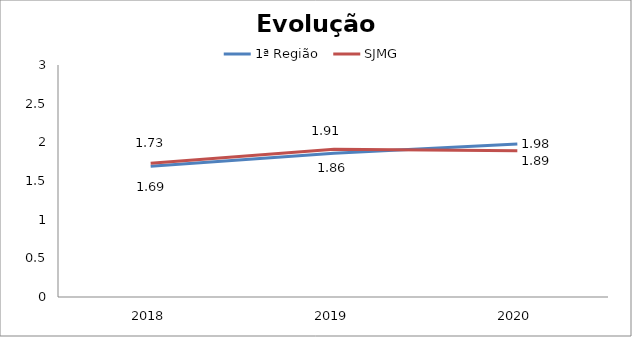
| Category | 1ª Região | SJMG |
|---|---|---|
| 0 | 1.69 | 1.73 |
| 1 | 1.86 | 1.91 |
| 2 | 1.98 | 1.89 |